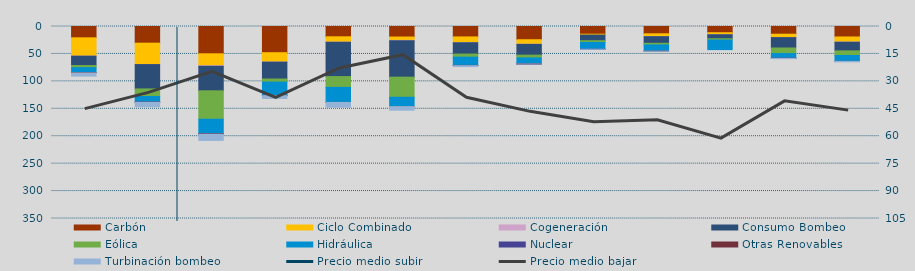
| Category | Carbón | Ciclo Combinado | Cogeneración | Consumo Bombeo | Eólica | Hidráulica | Nuclear | Otras Renovables | Turbinación bombeo |
|---|---|---|---|---|---|---|---|---|---|
| N | 20637.7 | 33409.3 | 40.8 | 17072.8 | 3847.5 | 8820.4 | 0 | 757.7 | 5932.4 |
| D | 30371.3 | 38818.7 | 239.5 | 44331.3 | 13873.3 | 10280.7 | 108.3 | 133.8 | 8046.3 |
| E | 49749 | 21689 | 1091.7 | 44705.2 | 51833.3 | 26560.6 | 159.6 | 521.7 | 11348.4 |
| F | 47780.9 | 17066.1 | 83.8 | 30784 | 5603.4 | 24359.1 | 40 | 286.6 | 5220.7 |
| M | 18764.1 | 9673.8 | 444.5 | 62414.7 | 19679.2 | 27422.5 | 0 | 20.9 | 8766.8 |
| A | 19179.5 | 6106.3 | 488.3 | 66560.4 | 36687.3 | 16841.6 | 0 | 122 | 6609.5 |
| M | 18994.1 | 10277 | 353.4 | 20633.9 | 5611.8 | 15058.8 | 96.2 | 322.7 | 1709.2 |
| J | 24116.3 | 8196.7 | 265.7 | 19665.3 | 5033.9 | 11035.4 | 68.9 | 6.7 | 99.1 |
| J | 14004.7 | 1618.9 | 0 | 10261.3 | 3196.4 | 12305.1 | 26 | 0 | 119 |
| A | 13306.6 | 5191.1 | 57.6 | 12019.4 | 2979.3 | 11389.1 | 0 | 6.3 | 169.4 |
| S | 11365.6 | 3650 | 17 | 7271.8 | 2373.2 | 17475.2 | 0 | 0 | 0 |
| O | 14046.3 | 6143.3 | 63.6 | 18912.3 | 10240.2 | 8461.2 | 80 | 59 | 580.2 |
| N | 19052.6 | 9321.8 | 284.1 | 15774.3 | 8408.4 | 10736.9 | 0 | 4.4 | 901.6 |